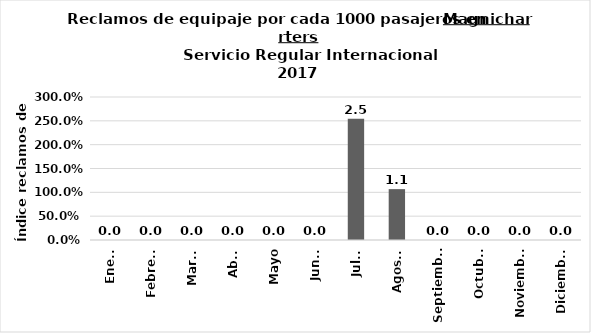
| Category | Reclamos por cada 1000 pasajeros |
|---|---|
| Enero | 0 |
| Febrero | 0 |
| Marzo | 0 |
| Abril | 0 |
| Mayo | 0 |
| Junio | 0 |
| Julio | 2.545 |
| Agosto | 1.067 |
| Septiembre | 0 |
| Octubre | 0 |
| Noviembre | 0 |
| Diciembre | 0 |